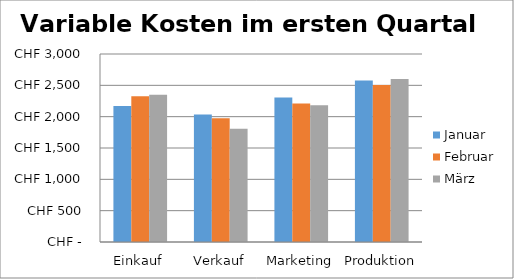
| Category | Januar | Februar | März |
|---|---|---|---|
| Einkauf | 2171 | 2324 | 2348 |
| Verkauf | 2033 | 1975 | 1809 |
| Marketing | 2306 | 2210 | 2182 |
| Produktion | 2576 | 2506 | 2603 |